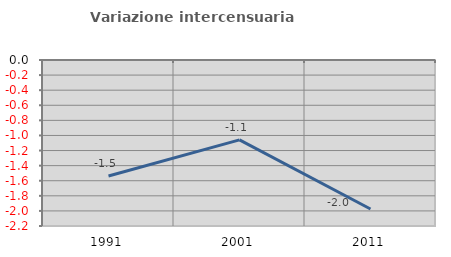
| Category | Variazione intercensuaria annua |
|---|---|
| 1991.0 | -1.537 |
| 2001.0 | -1.059 |
| 2011.0 | -1.975 |